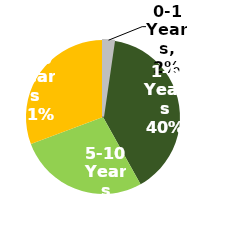
| Category | Series 0 |
|---|---|
| 0-1 Years | 0.023 |
| 1-5 Years | 0.396 |
| 5-10 Years | 0.274 |
| +10 Years | 0.307 |